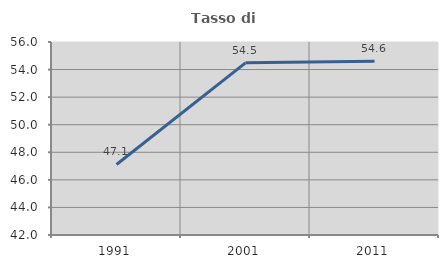
| Category | Tasso di occupazione   |
|---|---|
| 1991.0 | 47.116 |
| 2001.0 | 54.489 |
| 2011.0 | 54.61 |